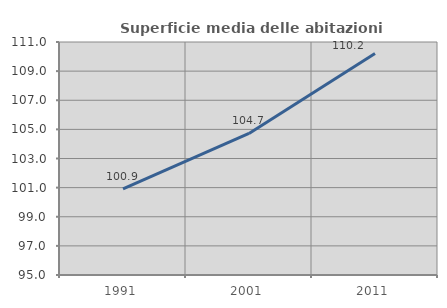
| Category | Superficie media delle abitazioni occupate |
|---|---|
| 1991.0 | 100.92 |
| 2001.0 | 104.718 |
| 2011.0 | 110.204 |